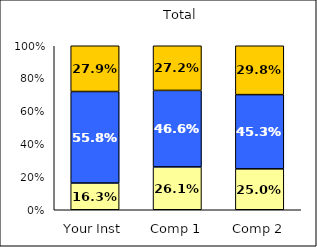
| Category | Low Social Agency | Average Social Agency | High Social Agency |
|---|---|---|---|
| Your Inst | 0.163 | 0.558 | 0.279 |
| Comp 1 | 0.261 | 0.466 | 0.272 |
| Comp 2 | 0.25 | 0.453 | 0.298 |